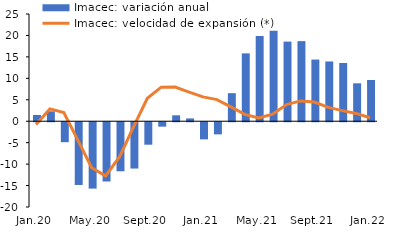
| Category | Imacec: variación anual |
|---|---|
| 2020-01-01 | 1.46 |
| 2020-02-01 | 2.31 |
| 2020-03-01 | -4.656 |
| 2020-04-01 | -14.628 |
| 2020-05-01 | -15.476 |
| 2020-06-01 | -13.821 |
| 2020-07-01 | -11.439 |
| 2020-08-01 | -10.8 |
| 2020-09-01 | -5.244 |
| 2020-10-01 | -1.031 |
| 2020-11-01 | 1.38 |
| 2020-12-01 | 0.651 |
| 2021-01-01 | -3.995 |
| 2021-02-01 | -2.834 |
| 2021-03-01 | 6.54 |
| 2021-04-01 | 15.818 |
| 2021-05-01 | 19.843 |
| 2021-06-01 | 21.113 |
| 2021-07-01 | 18.566 |
| 2021-08-01 | 18.671 |
| 2021-09-01 | 14.376 |
| 2021-10-01 | 13.934 |
| 2021-11-01 | 13.57 |
| 2021-12-01 | 8.841 |
| 2022-01-01 | 9.61 |